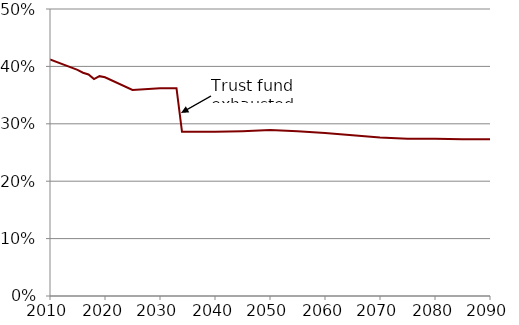
| Category | Series 1 |
|---|---|
| 2010.0 | 0.412 |
| 2015.0 | 0.394 |
| 2016.0 | 0.389 |
| 2017.0 | 0.386 |
| 2018.0 | 0.378 |
| 2019.0 | 0.383 |
| 2020.0 | 0.381 |
| 2025.0 | 0.359 |
| 2030.0 | 0.362 |
| 2031.0 | 0.362 |
| 2032.0 | 0.362 |
| 2033.0 | 0.362 |
| 2034.0 | 0.286 |
| 2035.0 | 0.286 |
| 2040.0 | 0.286 |
| 2045.0 | 0.287 |
| 2050.0 | 0.289 |
| 2055.0 | 0.287 |
| 2060.0 | 0.284 |
| 2065.0 | 0.28 |
| 2070.0 | 0.276 |
| 2075.0 | 0.274 |
| 2080.0 | 0.274 |
| 2085.0 | 0.273 |
| 2090.0 | 0.273 |